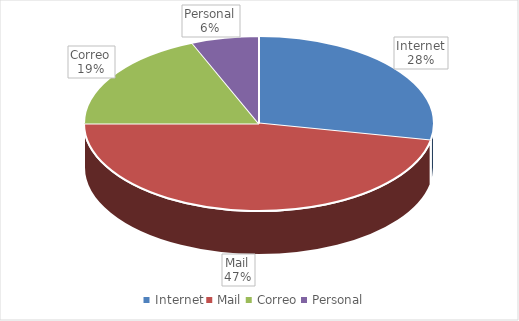
| Category | Series 0 |
|---|---|
| Internet | 9 |
| Mail | 15 |
| Correo | 6 |
| Personal | 2 |